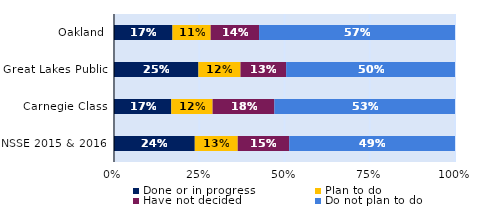
| Category | Done or in progress | Plan to do | Have not decided | Do not plan to do |
|---|---|---|---|---|
| Oakland | 0.171 | 0.112 | 0.142 | 0.575 |
| Great Lakes Public | 0.248 | 0.123 | 0.134 | 0.495 |
| Carnegie Class | 0.168 | 0.121 | 0.181 | 0.53 |
| NSSE 2015 & 2016 | 0.237 | 0.126 | 0.151 | 0.486 |